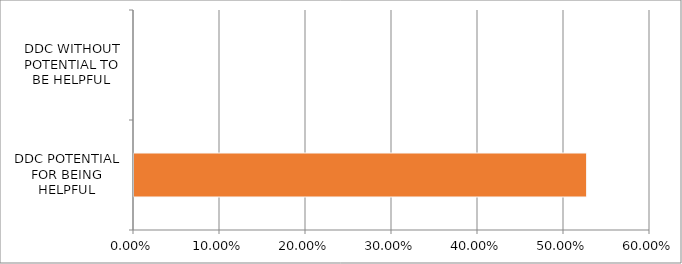
| Category | Series 0 |
|---|---|
| DDC POTENTIAL FOR BEING HELPFUL | 0.526 |
| DDC WITHOUT POTENTIAL TO BE HELPFUL | 0 |